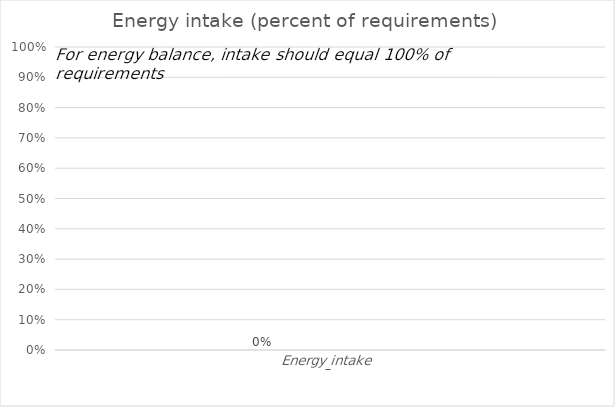
| Category | Series 0 | Series 1 |
|---|---|---|
| 0 | 0 |  |